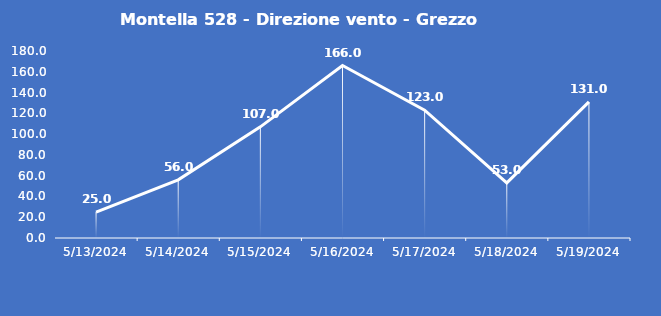
| Category | Montella 528 - Direzione vento - Grezzo (°N) |
|---|---|
| 5/13/24 | 25 |
| 5/14/24 | 56 |
| 5/15/24 | 107 |
| 5/16/24 | 166 |
| 5/17/24 | 123 |
| 5/18/24 | 53 |
| 5/19/24 | 131 |